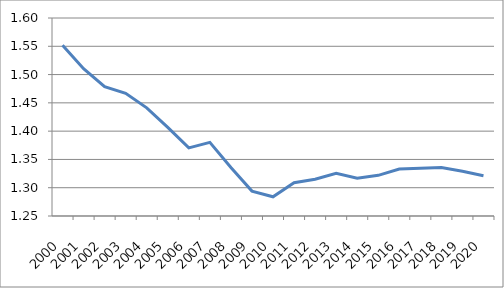
| Category | K/Y-forhold |
|---|---|
| 2000-01-01 | 1.552 |
| 2001-01-01 | 1.51 |
| 2002-01-01 | 1.479 |
| 2003-01-01 | 1.467 |
| 2004-01-01 | 1.441 |
| 2005-01-01 | 1.407 |
| 2006-01-01 | 1.37 |
| 2007-01-01 | 1.38 |
| 2008-01-01 | 1.336 |
| 2009-01-01 | 1.294 |
| 2010-01-01 | 1.284 |
| 2011-01-01 | 1.309 |
| 2012-01-01 | 1.315 |
| 2013-01-01 | 1.326 |
| 2014-01-01 | 1.317 |
| 2015-01-01 | 1.322 |
| 2016-01-01 | 1.333 |
| 2017-01-01 | 1.335 |
| 2018-01-01 | 1.336 |
| 2019-01-01 | 1.329 |
| 2020-01-01 | 1.321 |